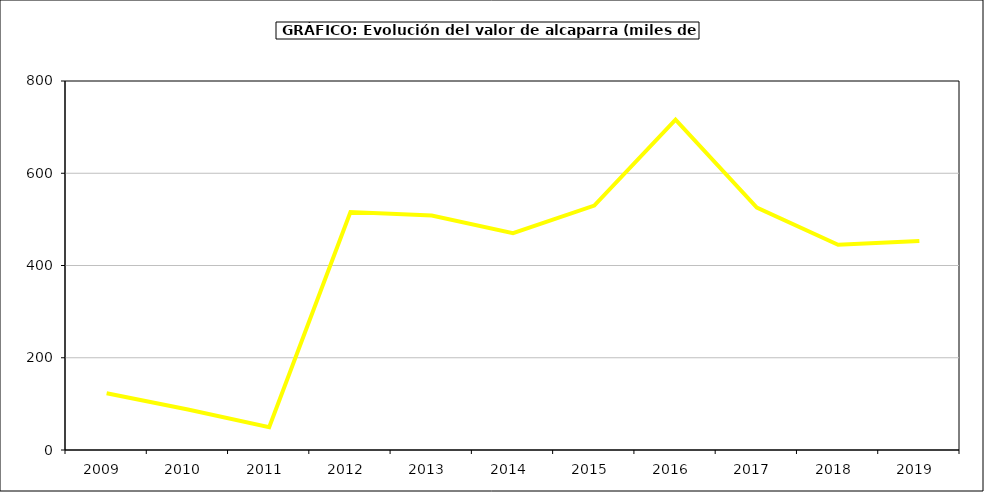
| Category | producción |
|---|---|
| 2009.0 | 123.08 |
| 2010.0 | 87.75 |
| 2011.0 | 49.5 |
| 2012.0 | 516 |
| 2013.0 | 508.5 |
| 2014.0 | 470 |
| 2015.0 | 530 |
| 2016.0 | 716 |
| 2017.0 | 525.442 |
| 2018.0 | 444.946 |
| 2019.0 | 453.123 |